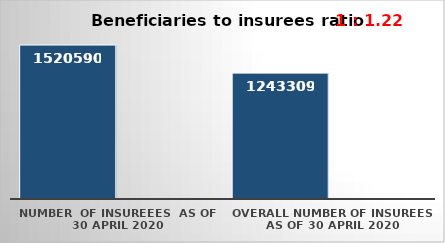
| Category | Series 0 | Series 1 |
|---|---|---|
| NUMBER  of insureees  as of  30 April 2020 | 1520590 |  |
| OVERALL number of insurees as of 30 April 2020 | 1243309 |  |